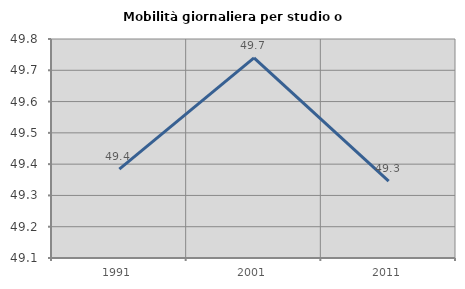
| Category | Mobilità giornaliera per studio o lavoro |
|---|---|
| 1991.0 | 49.384 |
| 2001.0 | 49.74 |
| 2011.0 | 49.346 |